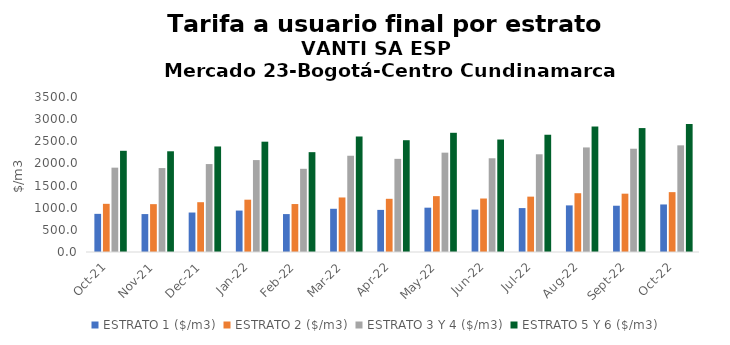
| Category | ESTRATO 1 ($/m3) | ESTRATO 2 ($/m3) | ESTRATO 3 Y 4 ($/m3) | ESTRATO 5 Y 6 ($/m3) |
|---|---|---|---|---|
| 2021-10-01 | 861.43 | 1087.83 | 1904.49 | 2285.388 |
| 2021-11-01 | 856.36 | 1080.57 | 1895.25 | 2274.3 |
| 2021-12-01 | 891.31 | 1124.51 | 1985.81 | 2382.972 |
| 2022-01-01 | 935.58 | 1181.34 | 2075.8 | 2490.96 |
| 2022-02-01 | 856.19 | 1082.91 | 1878.66 | 2254.392 |
| 2022-03-01 | 975.85 | 1231.21 | 2173.48 | 2608.176 |
| 2022-04-01 | 950.89 | 1201.22 | 2103.49 | 2524.188 |
| 2022-05-01 | 1000.88 | 1261.58 | 2243.11 | 2691.732 |
| 2022-06-01 | 957.2 | 1207.84 | 2116.44 | 2539.728 |
| 2022-07-01 | 991.75 | 1250.14 | 2206.55 | 2647.86 |
| 2022-08-01 | 1052.6 | 1327.26 | 2361.3 | 2833.56 |
| 2022-09-01 | 1044.96 | 1317 | 2332 | 2798.4 |
| 2022-10-01 | 1073.46 | 1351.82 | 2408.2 | 2889.84 |